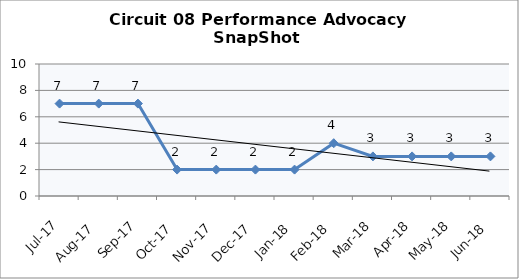
| Category | Circuit 08 |
|---|---|
| Jul-17 | 7 |
| Aug-17 | 7 |
| Sep-17 | 7 |
| Oct-17 | 2 |
| Nov-17 | 2 |
| Dec-17 | 2 |
| Jan-18 | 2 |
| Feb-18 | 4 |
| Mar-18 | 3 |
| Apr-18 | 3 |
| May-18 | 3 |
| Jun-18 | 3 |